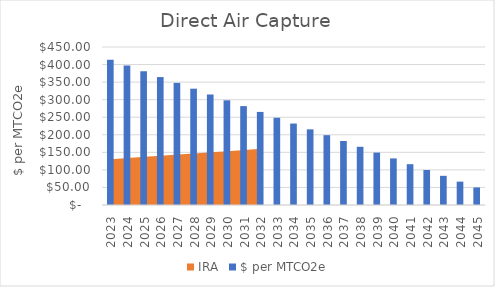
| Category | $ per MTCO2e |
|---|---|
| 2023.0 | 414 |
| 2024.0 | 397.455 |
| 2025.0 | 380.909 |
| 2026.0 | 364.364 |
| 2027.0 | 347.818 |
| 2028.0 | 331.273 |
| 2029.0 | 314.727 |
| 2030.0 | 298.182 |
| 2031.0 | 281.636 |
| 2032.0 | 265.091 |
| 2033.0 | 248.545 |
| 2034.0 | 232 |
| 2035.0 | 215.455 |
| 2036.0 | 198.909 |
| 2037.0 | 182.364 |
| 2038.0 | 165.818 |
| 2039.0 | 149.273 |
| 2040.0 | 132.727 |
| 2041.0 | 116.182 |
| 2042.0 | 99.636 |
| 2043.0 | 83.091 |
| 2044.0 | 66.545 |
| 2045.0 | 50 |